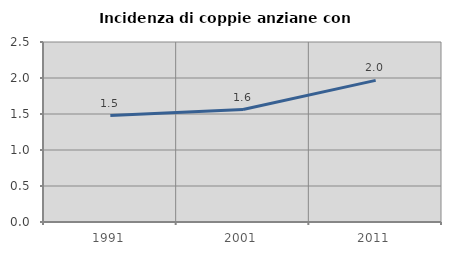
| Category | Incidenza di coppie anziane con figli |
|---|---|
| 1991.0 | 1.478 |
| 2001.0 | 1.562 |
| 2011.0 | 1.967 |